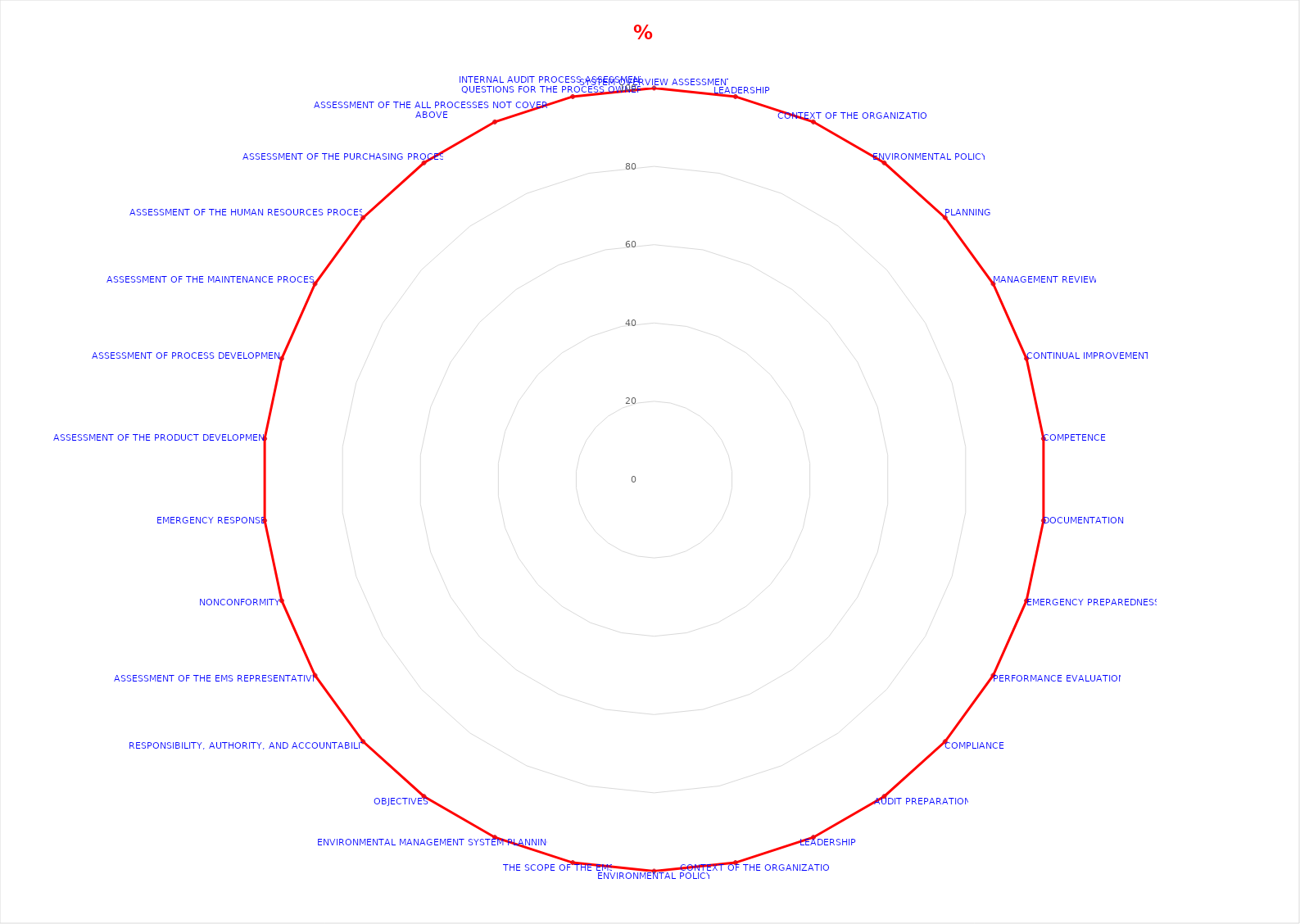
| Category | % Compliance |
|---|---|
| SYSTEM OVERVIEW ASSESSMENT | 100 |
| LEADERSHIP | 100 |
| CONTEXT OF THE ORGANIZATION | 100 |
| ENVIRONMENTAL POLICY | 100 |
| PLANNING | 100 |
| MANAGEMENT REVIEW | 100 |
| CONTINUAL IMPROVEMENT | 100 |
| COMPETENCE | 100 |
| DOCUMENTATION | 100 |
| EMERGENCY PREPAREDNESS | 100 |
| PERFORMANCE EVALUATION | 100 |
| COMPLIANCE | 100 |
| AUDIT PREPARATION | 100 |
| LEADERSHIP | 100 |
| CONTEXT OF THE ORGANIZATION | 100 |
| ENVIRONMENTAL POLICY | 100 |
| THE SCOPE OF THE EMS | 100 |
| ENVIRONMENTAL MANAGEMENT SYSTEM PLANNING | 100 |
| OBJECTIVES | 100 |
| RESPONSIBILITY, AUTHORITY, AND ACCOUNTABILITY | 100 |
| ASSESSMENT OF THE EMS REPRESENTATIVE  | 100 |
| NONCONFORMITY | 100 |
| EMERGENCY RESPONSE | 100 |
| ASSESSMENT OF THE PRODUCT DEVELOPMENT | 100 |
| ASSESSMENT OF PROCESS DEVELOPMENT | 100 |
| ASSESSMENT OF THE MAINTENANCE PROCESS | 100 |
| ASSESSMENT OF THE HUMAN RESOURCES PROCESS | 100 |
| ASSESSMENT OF THE PURCHASING PROCESS | 100 |
| ASSESSMENT OF THE ALL PROCESSES NOT COVERED ABOVE | 100 |
| INTERNAL AUDIT PROCESS ASSESSMENT
QUESTIONS FOR THE PROCESS OWNER | 100 |